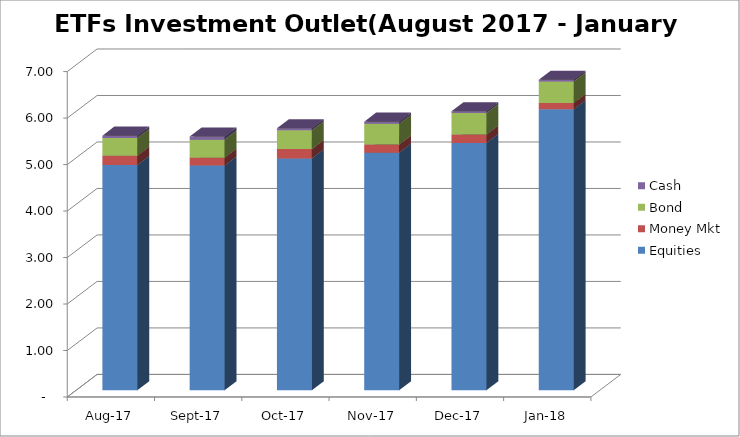
| Category | Equities | Money Mkt | Bond | Cash |
|---|---|---|---|---|
| 2017-08-01 | 4844657255.17 | 201591154.97 | 379243242.93 | 51169062.96 |
| 2017-09-01 | 4833111967.72 | 168172766.71 | 388932938.58 | 68776258.51 |
| 2017-10-01 | 4987236106.21 | 199138352.45 | 403914182.01 | 44490229.24 |
| 2017-11-01 | 5110642525.25 | 173439889.64 | 445730865.15 | 47372189.57 |
| 2017-12-01 | 5320268313.37 | 180659120.85 | 461893095.23 | 38551656.85 |
| 2018-01-01 | 6042563240.56 | 136904370.35 | 461893095.23 | 38893765.13 |